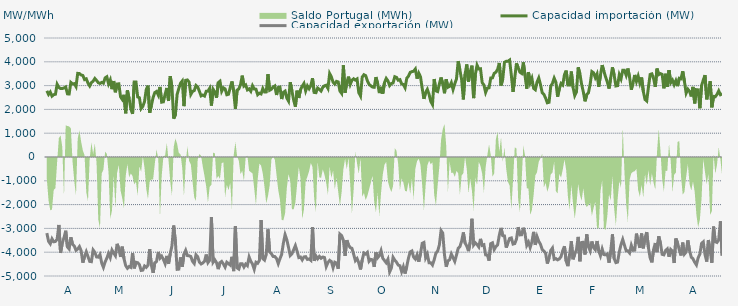
| Category | Capacidad importación (MW) | Capacidad exportación (MW) |
|---|---|---|
| 0 | 2778.75 | -3196.875 |
| 1900-01-01 | 2628.75 | -3541.875 |
| 1900-01-02 | 2728.125 | -3646.667 |
| 1900-01-03 | 2557.5 | -3436.875 |
| 1900-01-04 | 2619.375 | -3562.5 |
| 1900-01-05 | 2636.25 | -3549.375 |
| 1900-01-06 | 3056.25 | -3453.75 |
| 1900-01-07 | 2925 | -2854.5 |
| 1900-01-08 | 2874.375 | -4029.375 |
| 1900-01-09 | 2876.25 | -3616.875 |
| 1900-01-10 | 2900.625 | -3388.125 |
| 1900-01-11 | 2941.875 | -3097.5 |
| 1900-01-12 | 2653.125 | -3780 |
| 1900-01-13 | 2647.5 | -3864.375 |
| 1900-01-14 | 3133.125 | -3371.25 |
| 1900-01-15 | 3069.375 | -3673.125 |
| 1900-01-16 | 3082.5 | -3740.625 |
| 1900-01-17 | 2958.75 | -3920.625 |
| 1900-01-18 | 3513.75 | -3864.375 |
| 1900-01-19 | 3506.25 | -3763.125 |
| 1900-01-20 | 3446.25 | -3937.5 |
| 1900-01-21 | 3425.625 | -4440 |
| 1900-01-22 | 3253.125 | -4179.375 |
| 1900-01-23 | 3285 | -3980.417 |
| 1900-01-24 | 3105 | -4185 |
| 1900-01-25 | 2985 | -4387.5 |
| 1900-01-26 | 3123.75 | -4398.75 |
| 1900-01-27 | 3189.375 | -3905.625 |
| 1900-01-28 | 3298.125 | -4003.125 |
| 1900-01-29 | 3215.625 | -4200 |
| 1900-01-30 | 3121.875 | -4207.5 |
| 1900-01-31 | 3090 | -4100.625 |
| 1900-02-01 | 3133.125 | -4455 |
| 1900-02-02 | 3101.25 | -4636.875 |
| 1900-02-03 | 3324.375 | -4408.125 |
| 1900-02-04 | 3371.25 | -4248.75 |
| 1900-02-05 | 3075 | -4050 |
| 1900-02-06 | 3240 | -4228.125 |
| 1900-02-07 | 2850 | -3910 |
| 1900-02-08 | 3191.25 | -4035 |
| 1900-02-09 | 2720.625 | -4149.375 |
| 1900-02-10 | 3065.625 | -3648.75 |
| 1900-02-11 | 3075 | -3862.5 |
| 1900-02-12 | 2529.375 | -4198.125 |
| 1900-02-13 | 2418.75 | -3766.875 |
| 1900-02-14 | 2611.875 | -4272.292 |
| 1900-02-15 | 1836.25 | -4563.75 |
| 1900-02-16 | 2797.5 | -4674.375 |
| 1900-02-17 | 2448.75 | -4601.25 |
| 1900-02-18 | 2016.917 | -4637.083 |
| 1900-02-19 | 1812.292 | -4032.083 |
| 1900-02-20 | 3151.875 | -4680 |
| 1900-02-21 | 3150 | -4422.708 |
| 1900-02-22 | 2521.875 | -4441.875 |
| 1900-02-23 | 2488.333 | -4522.5 |
| 1900-02-24 | 2032.708 | -4766.25 |
| 1900-02-25 | 2126.25 | -4753.125 |
| 1900-02-26 | 2332.5 | -4578.75 |
| 1900-02-27 | 2836.875 | -4636.875 |
| 1900-02-28 | 2998.125 | -4548.75 |
| 1900-02-28 | 1860 | -3875.625 |
| 1900-03-01 | 2173.125 | -4548.75 |
| 1900-03-02 | 2501.25 | -4869.375 |
| 1900-03-03 | 2709.375 | -4443.75 |
| 1900-03-04 | 2754.375 | -4389.375 |
| 1900-03-05 | 2602.5 | -3988.125 |
| 1900-03-06 | 2943.75 | -4250.625 |
| 1900-03-07 | 2304.917 | -4167.5 |
| 1900-03-08 | 2317.5 | -4303.125 |
| 1900-03-09 | 2636.25 | -4481.25 |
| 1900-03-10 | 2900.625 | -4155 |
| 1900-03-11 | 2354.375 | -4488.75 |
| 1900-03-12 | 3395.625 | -4059.375 |
| 1900-03-13 | 2919.375 | -3729.375 |
| 1900-03-14 | 1612.5 | -2879.583 |
| 1900-03-15 | 1777.708 | -3564.375 |
| 1900-03-16 | 2624.875 | -4719.375 |
| 1900-03-17 | 2883.75 | -4711.875 |
| 1900-03-18 | 3101.25 | -4216.875 |
| 1900-03-19 | 3193.125 | -4616.25 |
| 1900-03-20 | 2137.5 | -4083.75 |
| 1900-03-21 | 3221.25 | -3922.5 |
| 1900-03-22 | 3238.125 | -4143.75 |
| 1900-03-23 | 3146.25 | -4149.375 |
| 1900-03-24 | 2629.583 | -4181.25 |
| 1900-03-25 | 2756.25 | -4383.75 |
| 1900-03-26 | 2791.875 | -4475.625 |
| 1900-03-27 | 3005.625 | -4110 |
| 1900-03-28 | 2943.75 | -4190.625 |
| 1900-03-29 | 2761.875 | -4417.5 |
| 1900-03-30 | 2566.875 | -4494.375 |
| 1900-03-31 | 2602.5 | -4453.125 |
| 1900-04-01 | 2561.25 | -4380 |
| 1900-04-02 | 2763.75 | -4098.75 |
| 1900-04-03 | 2769.375 | -4436.25 |
| 1900-04-04 | 2887.5 | -4333.125 |
| 1900-04-05 | 2159.625 | -2520.833 |
| 1900-04-06 | 2846.25 | -4423.125 |
| 1900-04-07 | 2730 | -4323.75 |
| 1900-04-08 | 2491.875 | -4438.125 |
| 1900-04-09 | 3123.75 | -4711.875 |
| 1900-04-10 | 3183.75 | -4440 |
| 1900-04-11 | 2761.875 | -4387.5 |
| 1900-04-12 | 2908.125 | -4496.25 |
| 1900-04-13 | 2861.25 | -4627.5 |
| 1900-04-14 | 2615.625 | -4421.25 |
| 1900-04-15 | 2636.25 | -4479.375 |
| 1900-04-16 | 2925 | -4541.25 |
| 1900-04-17 | 3172.917 | -4194.583 |
| 1900-04-18 | 2752.5 | -4794.375 |
| 1900-04-19 | 2024.208 | -2912.083 |
| 1900-04-20 | 2810.625 | -4661.25 |
| 1900-04-21 | 2859.375 | -4710 |
| 1900-04-22 | 3043.125 | -4486.875 |
| 1900-04-23 | 3418.125 | -4485 |
| 1900-04-24 | 2977.5 | -4623.75 |
| 1900-04-25 | 3028.125 | -4498.125 |
| 1900-04-26 | 2820 | -4565.625 |
| 1900-04-27 | 2863.125 | -4200 |
| 1900-04-28 | 2761.875 | -4381.875 |
| 1900-04-29 | 2994.375 | -4500 |
| 1900-04-30 | 2857.5 | -4715.625 |
| 1900-05-01 | 2850 | -4423.125 |
| 1900-05-02 | 2617.5 | -4466.25 |
| 1900-05-03 | 2681.25 | -4346.25 |
| 1900-05-04 | 2650 | -2650 |
| 1900-05-05 | 2876.25 | -4267.5 |
| 1900-05-06 | 2733.333 | -4333.125 |
| 1900-05-07 | 2735.625 | -4098.75 |
| 1900-05-08 | 3479.167 | -3041.667 |
| 1900-05-09 | 2805 | -3984.375 |
| 1900-05-10 | 2846.25 | -4065 |
| 1900-05-11 | 2941.875 | -4177.5 |
| 1900-05-12 | 2985 | -4183.125 |
| 1900-05-13 | 2606.25 | -4265.625 |
| 1900-05-14 | 2921.25 | -4481.25 |
| 1900-05-15 | 2938.125 | -4273.125 |
| 1900-05-16 | 2435 | -4091.25 |
| 1900-05-17 | 2716.875 | -3618.75 |
| 1900-05-18 | 2767.5 | -3264.375 |
| 1900-05-19 | 2476.875 | -3474.375 |
| 1900-05-20 | 2349.375 | -3798.75 |
| 1900-05-21 | 3142.5 | -4141.875 |
| 1900-05-22 | 2773.125 | -4066.875 |
| 1900-05-23 | 2390.625 | -3896.25 |
| 1900-05-24 | 2113.125 | -3723.75 |
| 1900-05-25 | 2786.25 | -3954.375 |
| 1900-05-26 | 2480.625 | -4226.25 |
| 1900-05-27 | 2829.375 | -4203.75 |
| 1900-05-28 | 2973.75 | -4323.75 |
| 1900-05-29 | 3090 | -4200 |
| 1900-05-30 | 2778.75 | -4186.875 |
| 1900-05-31 | 2986.875 | -4305 |
| 1900-06-01 | 2868.75 | -4282.5 |
| 1900-06-02 | 3000 | -4340.625 |
| 1900-06-03 | 3307.5 | -2947.5 |
| 1900-06-04 | 2713.125 | -4359.375 |
| 1900-06-05 | 2701.875 | -4158.75 |
| 1900-06-06 | 2896.875 | -4276.875 |
| 1900-06-07 | 2842.5 | -4177.5 |
| 1900-06-08 | 2773.125 | -4254.375 |
| 1900-06-09 | 2930.625 | -4201.875 |
| 1900-06-10 | 2990.625 | -4224.375 |
| 1900-06-11 | 3015 | -4603.125 |
| 1900-06-12 | 2883.75 | -4436.25 |
| 1900-06-13 | 3506.25 | -4342.5 |
| 1900-06-14 | 3367.5 | -4393.125 |
| 1900-06-15 | 3144.375 | -4653.75 |
| 1900-06-16 | 3063.75 | -4419.375 |
| 1900-06-17 | 3178.125 | -4456.875 |
| 1900-06-18 | 3153.75 | -4695 |
| 1900-06-19 | 2768.542 | -3240.125 |
| 1900-06-20 | 2672.083 | -3304.625 |
| 1900-06-21 | 3855 | -3498.75 |
| 1900-06-22 | 2703.125 | -4151.25 |
| 1900-06-23 | 3123.333 | -3495.125 |
| 1900-06-24 | 3376.875 | -3697.5 |
| 1900-06-25 | 3048.75 | -3805.875 |
| 1900-06-26 | 3225 | -3836.25 |
| 1900-06-27 | 3286.875 | -4085.625 |
| 1900-06-28 | 3230.625 | -4353.75 |
| 1900-06-29 | 3279.375 | -4267.5 |
| 1900-06-30 | 2704.917 | -4449.375 |
| 1900-07-01 | 2563.833 | -4725 |
| 1900-07-02 | 3360 | -4325.625 |
| 1900-07-03 | 3457.5 | -4035 |
| 1900-07-04 | 3420 | -4078.125 |
| 1900-07-05 | 3202.5 | -4005 |
| 1900-07-06 | 3050.625 | -4383.75 |
| 1900-07-07 | 2992.5 | -4301.25 |
| 1900-07-08 | 2938.125 | -4320 |
| 1900-07-09 | 2928.75 | -4614.375 |
| 1900-07-10 | 3356.25 | -4010.625 |
| 1900-07-11 | 3093.75 | -4231.875 |
| 1900-07-12 | 2686.875 | -4143.75 |
| 1900-07-13 | 2947.5 | -3935.625 |
| 1900-07-14 | 2664.375 | -4254.375 |
| 1900-07-15 | 3127.5 | -4350 |
| 1900-07-16 | 3300 | -4443.75 |
| 1900-07-17 | 3198.542 | -4296 |
| 1900-07-18 | 3001.875 | -4828.125 |
| 1900-07-19 | 3088.125 | -4666.875 |
| 1900-07-20 | 3110.625 | -4215 |
| 1900-07-21 | 3373.125 | -4336.875 |
| 1900-07-22 | 3345 | -4417.5 |
| 1900-07-23 | 3226.875 | -4541.25 |
| 1900-07-24 | 3251.25 | -4569.375 |
| 1900-07-25 | 3069.375 | -4816.875 |
| 1900-07-26 | 3046.875 | -4610.625 |
| 1900-07-27 | 2910 | -4897.5 |
| 1900-07-28 | 3309.375 | -4593.75 |
| 1900-07-29 | 3399.792 | -4243 |
| 1900-07-30 | 3556.875 | -3988.125 |
| 1900-07-31 | 3585.6 | -3948.08 |
| 1900-08-01 | 3605.625 | -4208.542 |
| 1900-08-02 | 3697.5 | -4290 |
| 1900-08-03 | 3291.25 | -4115.625 |
| 1900-08-04 | 3523.125 | -4398.75 |
| 1900-08-05 | 3371.25 | -4055.625 |
| 1900-08-06 | 2883.75 | -3628.125 |
| 1900-08-07 | 2445 | -3590.625 |
| 1900-08-08 | 2711.25 | -4233.75 |
| 1900-08-09 | 2842.292 | -4080 |
| 1900-08-10 | 2631.042 | -4443.75 |
| 1900-08-11 | 2333.542 | -4443.75 |
| 1900-08-12 | 2201.25 | -4537.5 |
| 1900-08-13 | 3275.625 | -4314.375 |
| 1900-08-14 | 2778.75 | -4038.75 |
| 1900-08-15 | 2749.167 | -3955 |
| 1900-08-16 | 3064.375 | -3696.875 |
| 1900-08-17 | 3341.083 | -3091.583 |
| 1900-08-18 | 3070.042 | -3200 |
| 1900-08-19 | 2678.625 | -4117.917 |
| 1900-08-20 | 3264.375 | -4610.625 |
| 1900-08-21 | 2928.75 | -4363.125 |
| 1900-08-22 | 2966.25 | -4316.25 |
| 1900-08-23 | 3121.875 | -4074.375 |
| 1900-08-24 | 2836.875 | -4230 |
| 1900-08-25 | 3078.75 | -4385.625 |
| 1900-08-26 | 3281.25 | -4121.25 |
| 1900-08-27 | 4027.5 | -3836.25 |
| 1900-08-28 | 3646.875 | -3765 |
| 1900-08-29 | 3256.875 | -3536.25 |
| 1900-08-30 | 2419.833 | -3170.625 |
| 1900-08-31 | 3472.5 | -3611.25 |
| 1900-09-01 | 3890.625 | -3742.5 |
| 1900-09-02 | 3166.875 | -3954.375 |
| 1900-09-03 | 3577.5 | -3583.125 |
| 1900-09-04 | 3836 | -2595.625 |
| 1900-09-05 | 2475 | -3700 |
| 1900-09-06 | 3466.875 | -3605.625 |
| 1900-09-07 | 3856.875 | -3676.458 |
| 1900-09-08 | 3697.5 | -3778.125 |
| 1900-09-09 | 3708.75 | -3440.625 |
| 1900-09-10 | 3125.625 | -3712.5 |
| 1900-09-11 | 3026.792 | -3685.625 |
| 1900-09-12 | 2711.458 | -4111.875 |
| 1900-09-13 | 2894.583 | -4117.5 |
| 1900-09-14 | 2908.583 | -4353.75 |
| 1900-09-15 | 3321.875 | -3639.375 |
| 1900-09-16 | 3324.375 | -3603.75 |
| 1900-09-17 | 3515.833 | -3886.875 |
| 1900-09-18 | 3562.5 | -3763.125 |
| 1900-09-19 | 3684.792 | -3688.125 |
| 1900-09-20 | 3950.625 | -3281.25 |
| 1900-09-21 | 3006.042 | -2979.375 |
| 1900-09-22 | 3276.667 | -3305.625 |
| 1900-09-23 | 3978.75 | -3315 |
| 1900-09-24 | 4018.125 | -3806.25 |
| 1900-09-25 | 4020 | -3611.25 |
| 1900-09-26 | 4072.5 | -3421.458 |
| 1900-09-27 | 3435 | -3400.208 |
| 1900-09-28 | 2733.458 | -3658.125 |
| 1900-09-29 | 3328.542 | -3637.5 |
| 1900-09-30 | 3937.5 | -3451.875 |
| 1900-10-01 | 3746.25 | -2948.958 |
| 1900-10-02 | 3564.375 | -3273.75 |
| 1900-10-03 | 3513.75 | -3266.25 |
| 1900-10-04 | 3975 | -2973.75 |
| 1900-10-05 | 3418.125 | -3228.75 |
| 1900-10-06 | 2868.75 | -3712.5 |
| 1900-10-07 | 3568.125 | -3577.5 |
| 1900-10-08 | 3120 | -3802.5 |
| 1900-10-09 | 3305.625 | -3564.375 |
| 1900-10-10 | 2884.375 | -3145.875 |
| 1900-10-11 | 2826.25 | -3695.625 |
| 1900-10-12 | 3149.792 | -3346.875 |
| 1900-10-13 | 3321.458 | -3540 |
| 1900-10-14 | 3048.75 | -3665.625 |
| 1900-10-15 | 2704.25 | -3881.25 |
| 1900-10-16 | 2627.25 | -3950.625 |
| 1900-10-17 | 2475.708 | -4038.75 |
| 1900-10-18 | 2277.917 | -4477.5 |
| 1900-10-19 | 2300 | -4239.375 |
| 1900-10-20 | 2972.708 | -3928.125 |
| 1900-10-21 | 3093.75 | -3825 |
| 1900-10-22 | 3313.333 | -4297.5 |
| 1900-10-23 | 3141.75 | -4268.125 |
| 1900-10-24 | 2533.125 | -4321.875 |
| 1900-10-25 | 2863.375 | -4282.5 |
| 1900-10-26 | 3088.125 | -4185 |
| 1900-10-27 | 3024.375 | -3931.875 |
| 1900-10-28 | 3459.375 | -3751.875 |
| 1900-10-29 | 3630 | -4380 |
| 1900-10-30 | 3020.625 | -4586.25 |
| 1900-10-31 | 3020.625 | -4091.25 |
| 1900-11-01 | 3592.5 | -3540 |
| 1900-11-02 | 2925 | -4297.5 |
| 1900-11-03 | 2582.625 | -4080.542 |
| 1900-11-04 | 2730 | -3900.625 |
| 1900-11-05 | 3769.167 | -3357.25 |
| 1900-11-06 | 3498.625 | -4380 |
| 1900-11-07 | 3058.125 | -3591.583 |
| 1900-11-08 | 2735.625 | -3581.875 |
| 1900-11-09 | 2339.792 | -4096.875 |
| 1900-11-10 | 2622.625 | -3250.667 |
| 1900-11-11 | 2697.5 | -3770.625 |
| 1900-11-12 | 3064.167 | -3943.625 |
| 1900-11-13 | 3588.75 | -3549.375 |
| 1900-11-14 | 3535.75 | -3810 |
| 1900-11-15 | 3333.958 | -3898.125 |
| 1900-11-16 | 3486.625 | -3530.542 |
| 1900-11-17 | 2951.375 | -3943.125 |
| 1900-11-18 | 3439.375 | -4149.375 |
| 1900-11-19 | 3860.625 | -3864.375 |
| 1900-11-20 | 3609.583 | -4100.625 |
| 1900-11-21 | 3359.75 | -4110 |
| 1900-11-22 | 3152.25 | -4073.75 |
| 1900-11-23 | 2876.25 | -4441.875 |
| 1900-11-24 | 3331.25 | -3948.75 |
| 1900-11-25 | 3768.75 | -3251.25 |
| 1900-11-26 | 3435.667 | -4269.375 |
| 1900-11-27 | 2984.167 | -4438.125 |
| 1900-11-28 | 2998.583 | -4415.625 |
| 1900-11-29 | 3457.333 | -3980.625 |
| 1900-11-30 | 3283.042 | -3676.875 |
| 1900-12-01 | 3641.25 | -3464.5 |
| 1900-12-02 | 3640.708 | -3708.75 |
| 1900-12-03 | 3435.708 | -3937.5 |
| 1900-12-04 | 3718.125 | -3943.125 |
| 1900-12-05 | 3344.458 | -4031.25 |
| 1900-12-06 | 2827.083 | -3710.625 |
| 1900-12-07 | 3113.75 | -3920.625 |
| 1900-12-08 | 3448.125 | -3913.125 |
| 1900-12-09 | 3172.083 | -3219.375 |
| 1900-12-10 | 3397.5 | -3562.5 |
| 1900-12-11 | 3101.042 | -3819.375 |
| 1900-12-12 | 3341.25 | -3215.625 |
| 1900-12-13 | 2760.833 | -3838.125 |
| 1900-12-14 | 2417.5 | -3395.625 |
| 1900-12-15 | 2354.583 | -3155.625 |
| 1900-12-16 | 2936.875 | -3811.875 |
| 1900-12-17 | 3468.75 | -4241.25 |
| 1900-12-18 | 3495 | -4426.875 |
| 1900-12-19 | 3297.083 | -3890.625 |
| 1900-12-20 | 2946.292 | -3613.125 |
| 1900-12-21 | 3714.792 | -3997.5 |
| 1900-12-22 | 3460.833 | -3331.875 |
| 1900-12-23 | 3502.917 | -3618.5 |
| 1900-12-24 | 3472.5 | -4089.375 |
| 1900-12-25 | 2885.87 | -4111.304 |
| 1900-12-26 | 3496.875 | -3930 |
| 1900-12-27 | 2942.5 | -3858.75 |
| 1900-12-28 | 3650.625 | -4194.375 |
| 1900-12-29 | 3122.458 | -3885 |
| 1900-12-30 | 3230.042 | -3961.875 |
| 1900-12-31 | 3034.208 | -4453.125 |
| 1901-01-01 | 3206.25 | -3423.75 |
| 1901-01-02 | 2977.5 | -3611.25 |
| 1901-01-03 | 3309.375 | -3911.25 |
| 1901-01-04 | 3288.75 | -4138.125 |
| 1901-01-05 | 3602.833 | -3596.25 |
| 1901-01-06 | 3174.375 | -4080 |
| 1901-01-07 | 2683.667 | -3991.875 |
| 1901-01-08 | 2848.875 | -3504.833 |
| 1901-01-09 | 2758.542 | -3938.333 |
| 1901-01-10 | 2545.417 | -4209.375 |
| 1901-01-11 | 2945.625 | -4278.75 |
| 1901-01-12 | 2252.5 | -4423.125 |
| 1901-01-13 | 2829.375 | -4533.75 |
| 1901-01-14 | 2820.917 | -4235.625 |
| 1901-01-15 | 2048.125 | -4081.208 |
| 1901-01-16 | 3003.75 | -3632.292 |
| 1901-01-17 | 3232.5 | -3565.625 |
| 1901-01-18 | 3440.625 | -4096.875 |
| 1901-01-19 | 2422.5 | -4393.125 |
| 1901-01-20 | 2763.958 | -3487.5 |
| 1901-01-21 | 3183.75 | -3943.125 |
| 1901-01-22 | 2087.083 | -4443.75 |
| 1901-01-23 | 2547 | -2925.75 |
| 1901-01-24 | 2531.667 | -3560.625 |
| 1901-01-25 | 2628.75 | -3590.625 |
| 1901-01-26 | 2778.75 | -3480 |
| 1901-01-27 | 2617.292 | -2701.792 |
| 1901-01-28 | 2655 | -4141.875 |